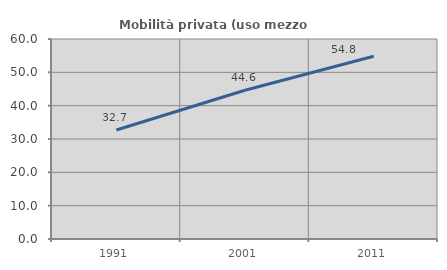
| Category | Mobilità privata (uso mezzo privato) |
|---|---|
| 1991.0 | 32.695 |
| 2001.0 | 44.609 |
| 2011.0 | 54.823 |